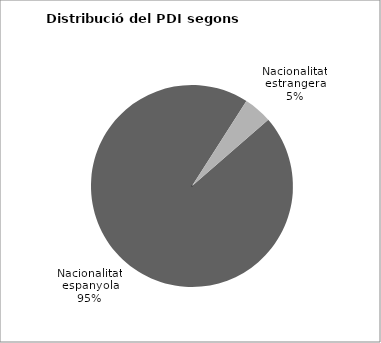
| Category | Series 0 |
|---|---|
| Nacionalitat espanyola | 2431 |
| Nacionalitat estrangera | 116 |